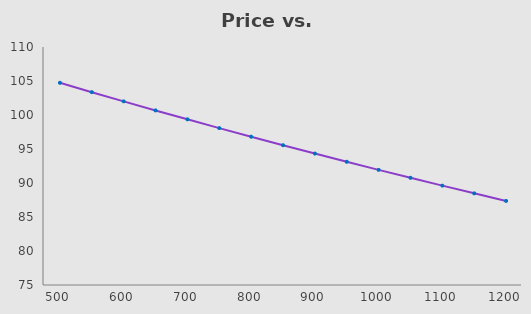
| Category | Series 0 |
|---|---|
| 500.0 | 104.733 |
| 550.0 | 103.358 |
| 600.0 | 102.004 |
| 650.0 | 100.673 |
| 700.0 | 99.363 |
| 750.0 | 98.075 |
| 800.0 | 96.807 |
| 850.0 | 95.559 |
| 900.0 | 94.331 |
| 950.0 | 93.123 |
| 1000.0 | 91.934 |
| 1050.0 | 90.764 |
| 1100.0 | 89.613 |
| 1150.0 | 88.479 |
| 1200.0 | 87.364 |